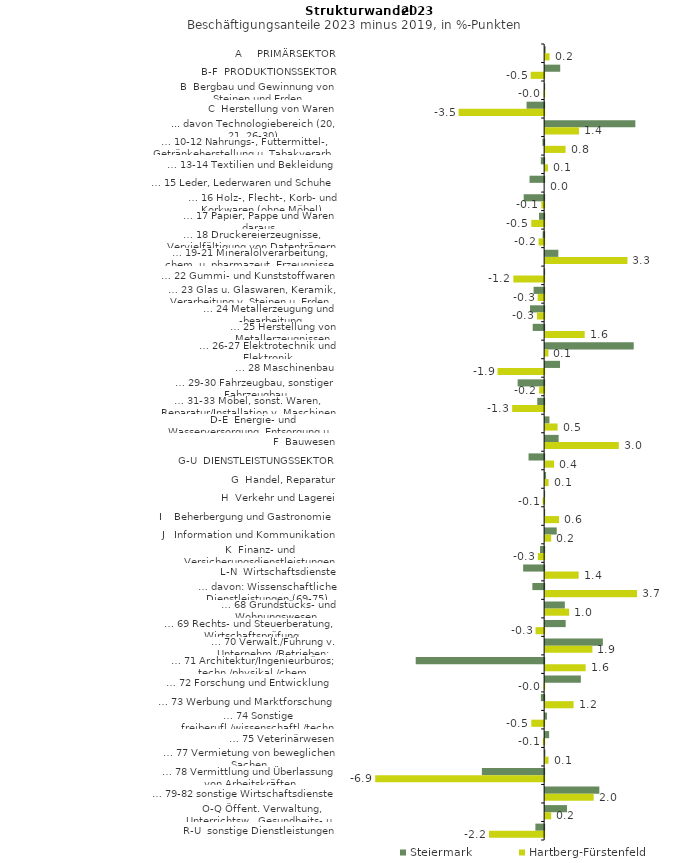
| Category | Steiermark | Hartberg-Fürstenfeld |
|---|---|---|
| A     PRIMÄRSEKTOR | 0.022 | 0.177 |
| B-F  PRODUKTIONSSEKTOR | 0.612 | -0.545 |
| B  Bergbau und Gewinnung von Steinen und Erden | -0.009 | -0.024 |
| C  Herstellung von Waren | -0.714 | -3.47 |
| ... davon Technologiebereich (20, 21, 26-30) | 3.66 | 1.376 |
| … 10-12 Nahrungs-, Futtermittel-, Getränkeherstellung u. Tabakverarb. | -0.068 | 0.829 |
| … 13-14 Textilien und Bekleidung | -0.134 | 0.115 |
| … 15 Leder, Lederwaren und Schuhe | -0.593 | 0 |
| … 16 Holz-, Flecht-, Korb- und Korkwaren (ohne Möbel)  | -0.83 | -0.112 |
| … 17 Papier, Pappe und Waren daraus  | -0.208 | -0.522 |
| … 18 Druckereierzeugnisse, Vervielfältigung von Datenträgern | -0.063 | -0.226 |
| … 19-21 Mineralölverarbeitung, chem. u. pharmazeut. Erzeugnisse | 0.535 | 3.34 |
| … 22 Gummi- und Kunststoffwaren | -0.02 | -1.249 |
| … 23 Glas u. Glaswaren, Keramik, Verarbeitung v. Steinen u. Erden  | -0.429 | -0.262 |
| … 24 Metallerzeugung und -bearbeitung | -0.572 | -0.292 |
| … 25 Herstellung von Metallerzeugnissen  | -0.464 | 1.605 |
| … 26-27 Elektrotechnik und Elektronik | 3.595 | 0.134 |
| … 28 Maschinenbau | 0.604 | -1.893 |
| … 29-30 Fahrzeugbau, sonstiger Fahrzeugbau | -1.076 | -0.205 |
| … 31-33 Möbel, sonst. Waren, Reparatur/Installation v. Maschinen | -0.279 | -1.298 |
| D-E  Energie- und Wasserversorgung, Entsorgung u. Rückgewinnung | 0.175 | 0.505 |
| F  Bauwesen | 0.547 | 2.989 |
| G-U  DIENSTLEISTUNGSSEKTOR | -0.633 | 0.365 |
| G  Handel, Reparatur | 0.038 | 0.14 |
| H  Verkehr und Lagerei | -0.011 | -0.062 |
| I    Beherbergung und Gastronomie | -0.007 | 0.566 |
| J   Information und Kommunikation | 0.471 | 0.245 |
| K  Finanz- und Versicherungsdienstleistungen | -0.168 | -0.255 |
| L-N  Wirtschaftsdienste | -0.853 | 1.358 |
| … davon: Wissenschaftliche Dienstleistungen (69-75) | -0.478 | 3.729 |
| … 68 Grundstücks- und Wohnungswesen  | 0.798 | 0.975 |
| … 69 Rechts- und Steuerberatung, Wirtschaftsprüfung | 0.834 | -0.349 |
| … 70 Verwalt./Führung v. Unternehm./Betrieben; Unternehmensberat. | 2.342 | 1.919 |
| … 71 Architektur/Ingenieurbüros; techn./physikal./chem. Untersuchung | -5.212 | 1.644 |
| … 72 Forschung und Entwicklung  | 1.449 | -0.022 |
| … 73 Werbung und Marktforschung | -0.133 | 1.155 |
| … 74 Sonstige freiberufl./wissenschaftl./techn. Tätigkeiten | 0.074 | -0.52 |
| … 75 Veterinärwesen | 0.163 | -0.052 |
| … 77 Vermietung von beweglichen Sachen  | 0.011 | 0.137 |
| … 78 Vermittlung und Überlassung von Arbeitskräften | -2.527 | -6.856 |
| … 79-82 sonstige Wirtschaftsdienste | 2.199 | 1.969 |
| O-Q Öffent. Verwaltung, Unterrichtsw., Gesundheits- u. Sozialwesen | 0.886 | 0.247 |
| R-U  sonstige Dienstleistungen | -0.355 | -2.238 |